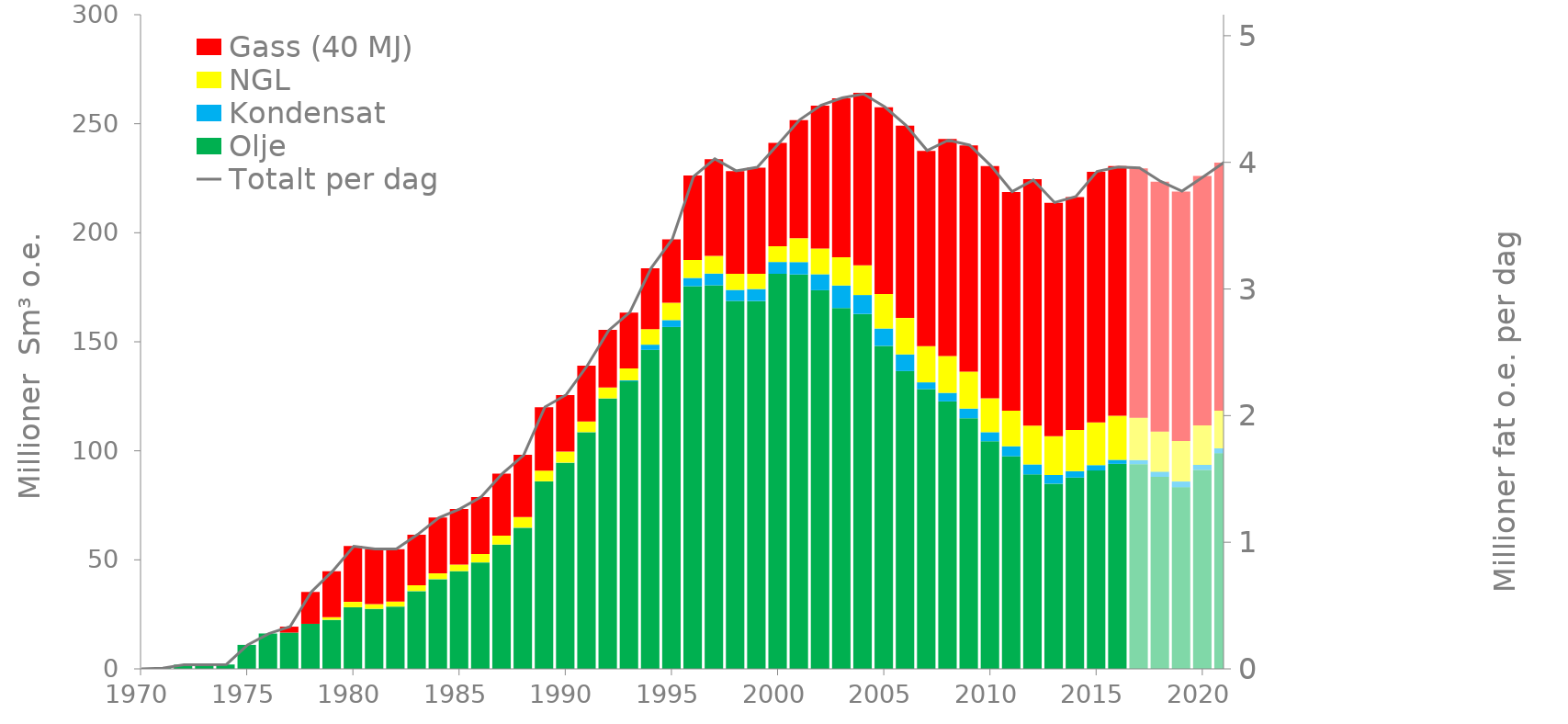
| Category | Olje | Kondensat | NGL | Gass (40 MJ) |
|---|---|---|---|---|
| 1970.0 | 0 | 0 | 0 | 0 |
| 1971.0 | 0.36 | 0 | 0 | 0 |
| 1972.0 | 1.93 | 0 | 0 | 0 |
| 1973.0 | 1.87 | 0 | 0 | 0 |
| 1974.0 | 2.01 | 0 | 0 | 0 |
| 1975.0 | 11 | 0 | 0 | 0 |
| 1976.0 | 16.23 | 0 | 0 | 0 |
| 1977.0 | 16.64 | 0 | 0 | 2.72 |
| 1978.0 | 20.64 | 0.02 | 0 | 14.62 |
| 1979.0 | 22.48 | 0.04 | 1.13 | 21.11 |
| 1980.0 | 28.22 | 0.05 | 2.44 | 25.64 |
| 1981.0 | 27.48 | 0.05 | 2.17 | 25.28 |
| 1982.0 | 28.53 | 0.04 | 2.29 | 24.06 |
| 1983.0 | 35.65 | 0.04 | 2.68 | 23.17 |
| 1984.0 | 41.09 | 0.06 | 2.64 | 25.63 |
| 1985.0 | 44.76 | 0.08 | 2.97 | 25.51 |
| 1986.0 | 48.77 | 0.06 | 3.85 | 26.15 |
| 1987.0 | 56.96 | 0.05 | 4.12 | 28.4 |
| 1988.0 | 64.72 | 0.05 | 4.85 | 28.58 |
| 1989.0 | 85.98 | 0.05 | 4.9 | 29.08 |
| 1990.0 | 94.54 | 0.05 | 5.01 | 25.99 |
| 1991.0 | 108.51 | 0.06 | 4.9 | 25.56 |
| 1992.0 | 124 | 0.05 | 4.96 | 26.5 |
| 1993.0 | 131.84 | 0.47 | 5.52 | 25.56 |
| 1994.0 | 146.28 | 2.4 | 7.12 | 27.88 |
| 1995.0 | 156.78 | 3.18 | 7.94 | 29.07 |
| 1996.0 | 175.5 | 3.78 | 8.23 | 38.75 |
| 1997.0 | 175.91 | 5.38 | 8.07 | 44.36 |
| 1998.0 | 168.74 | 5.05 | 7.39 | 47.06 |
| 1999.0 | 168.69 | 5.51 | 6.99 | 48.7 |
| 2000.0 | 181.18 | 5.41 | 7.23 | 47.43 |
| 2001.0 | 180.88 | 5.67 | 10.92 | 54.15 |
| 2002.0 | 173.65 | 7.32 | 11.8 | 65.53 |
| 2003.0 | 165.48 | 10.34 | 12.93 | 72.93 |
| 2004.0 | 162.78 | 8.67 | 13.6 | 79.1 |
| 2005.0 | 148.14 | 7.95 | 15.81 | 85.67 |
| 2006.0 | 136.58 | 7.63 | 16.7 | 88.23 |
| 2007.0 | 128.28 | 3.13 | 16.63 | 89.51 |
| 2008.0 | 122.66 | 3.92 | 16.94 | 99.46 |
| 2009.0 | 114.94 | 4.44 | 16.96 | 103.68 |
| 2010.0 | 104.39 | 4.16 | 15.51 | 106.53 |
| 2011.0 | 97.51 | 4.58 | 16.31 | 100.3 |
| 2012.0 | 89.2 | 4.57 | 17.8 | 113.06 |
| 2013.0 | 84.95 | 3.99 | 17.72 | 107.05 |
| 2014.0 | 87.74 | 2.91 | 18.95 | 106.796 |
| 2015.0 | 90.97 | 2.47 | 19.6 | 114.92 |
| 2016.0 | 94.009 | 1.88 | 20.176 | 114.528 |
| 2017.0 | 93.88 | 1.833 | 19.37 | 114.47 |
| 2018.0 | 88.05 | 2.375 | 18.42 | 114.54 |
| 2019.0 | 83.3 | 2.611 | 18.56 | 114.46 |
| 2020.0 | 91.27 | 2.3 | 18.13 | 114.34 |
| 2021.0 | 98.9 | 2.217 | 17.32 | 113.76 |